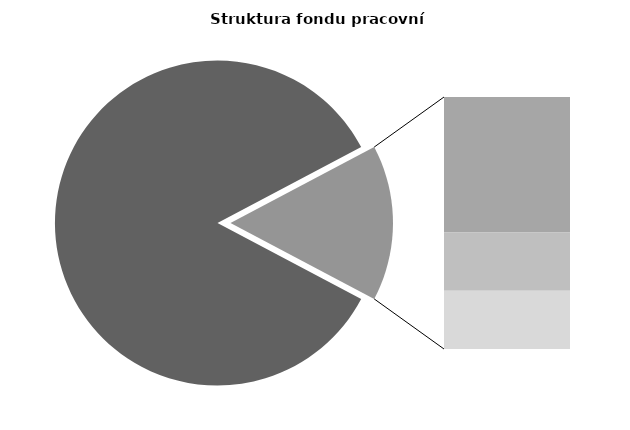
| Category | Series 0 |
|---|---|
| Průměrná měsíční odpracovaná doba bez přesčasu | 144.912 |
| Dovolená | 14.26 |
| Nemoc | 6.134 |
| Jiné | 6.132 |